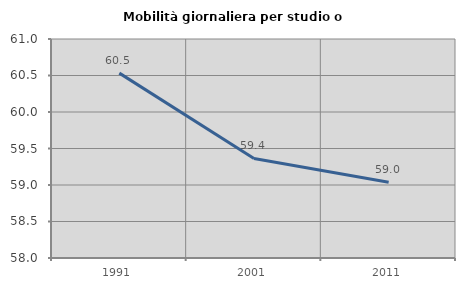
| Category | Mobilità giornaliera per studio o lavoro |
|---|---|
| 1991.0 | 60.532 |
| 2001.0 | 59.364 |
| 2011.0 | 59.037 |